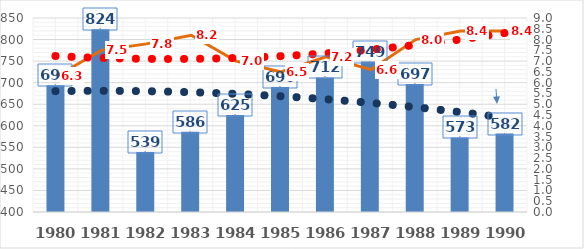
| Category | srážky [mm] |
|---|---|
| 1980.0 | 694 |
| 1981.0 | 824 |
| 1982.0 | 539 |
| 1983.0 | 586 |
| 1984.0 | 625 |
| 1985.0 | 690 |
| 1986.0 | 712 |
| 1987.0 | 749 |
| 1988.0 | 697 |
| 1989.0 | 573 |
| 1990.0 | 582 |